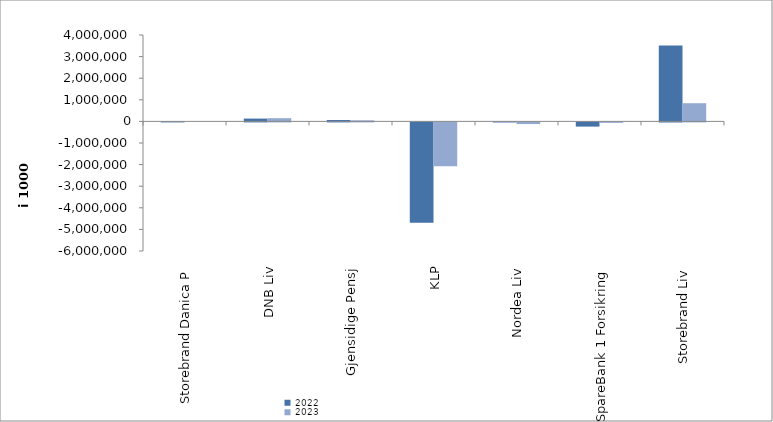
| Category | 2022 | 2023 |
|---|---|---|
| Storebrand Danica P | 4710.645 | 0 |
| DNB Liv | 130297 | 150113 |
| Gjensidige Pensj | 64683 | 50691 |
| KLP | -4649242.229 | -2033658.524 |
| Nordea Liv | -2551.892 | -77105.45 |
| SpareBank 1 Forsikring | -194276.143 | -21187.246 |
| Storebrand Liv | 3516428.957 | 841479.935 |